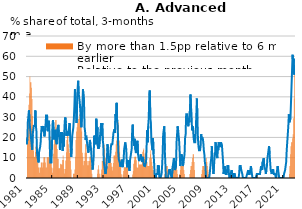
| Category | By more than 1.5pp relative to 6 months earlier |
|---|---|
| 1981-01-31 | 19.444 |
| 1981-02-28 | 22.222 |
| 1981-03-31 | 27.778 |
| 1981-04-30 | 36.111 |
| 1981-05-31 | 41.667 |
| 1981-06-30 | 50 |
| 1981-07-31 | 47.222 |
| 1981-08-31 | 47.222 |
| 1981-09-30 | 44.444 |
| 1981-10-31 | 38.889 |
| 1981-11-30 | 30.556 |
| 1981-12-31 | 16.667 |
| 1982-01-31 | 13.462 |
| 1982-02-28 | 10.47 |
| 1982-03-31 | 10.256 |
| 1982-04-30 | 12.821 |
| 1982-05-31 | 15.385 |
| 1982-06-30 | 23.077 |
| 1982-07-31 | 17.949 |
| 1982-08-31 | 15.385 |
| 1982-09-30 | 7.692 |
| 1982-10-31 | 5.128 |
| 1982-11-30 | 5.128 |
| 1982-12-31 | 2.564 |
| 1983-01-31 | 5.128 |
| 1983-02-28 | 5.128 |
| 1983-03-31 | 7.692 |
| 1983-04-30 | 7.692 |
| 1983-05-31 | 5.128 |
| 1983-06-30 | 7.692 |
| 1983-07-31 | 7.692 |
| 1983-08-31 | 10.256 |
| 1983-09-30 | 10.256 |
| 1983-10-31 | 10.256 |
| 1983-11-30 | 7.692 |
| 1983-12-31 | 5.128 |
| 1984-01-31 | 5.128 |
| 1984-02-29 | 10.256 |
| 1984-03-31 | 10.256 |
| 1984-04-30 | 10.256 |
| 1984-05-31 | 10.256 |
| 1984-06-30 | 12.821 |
| 1984-07-31 | 20.513 |
| 1984-08-31 | 20.513 |
| 1984-09-30 | 17.949 |
| 1984-10-31 | 10.256 |
| 1984-11-30 | 5.128 |
| 1984-12-31 | 2.564 |
| 1985-01-31 | 4.762 |
| 1985-02-28 | 11.905 |
| 1985-03-31 | 16.667 |
| 1985-04-30 | 19.048 |
| 1985-05-31 | 21.429 |
| 1985-06-30 | 28.571 |
| 1985-07-31 | 28.571 |
| 1985-08-31 | 21.429 |
| 1985-09-30 | 14.286 |
| 1985-10-31 | 9.524 |
| 1985-11-30 | 9.524 |
| 1985-12-31 | 4.762 |
| 1986-01-31 | 4.762 |
| 1986-02-28 | 4.762 |
| 1986-03-31 | 6.984 |
| 1986-04-30 | 6.825 |
| 1986-05-31 | 6.667 |
| 1986-06-30 | 6.667 |
| 1986-07-31 | 8.889 |
| 1986-08-31 | 11.111 |
| 1986-09-30 | 8.889 |
| 1986-10-31 | 4.444 |
| 1986-11-30 | 2.222 |
| 1986-12-31 | 4.444 |
| 1987-01-31 | 8.611 |
| 1987-02-28 | 12.639 |
| 1987-03-31 | 18.75 |
| 1987-04-30 | 20.833 |
| 1987-05-31 | 20.833 |
| 1987-06-30 | 16.667 |
| 1987-07-31 | 14.583 |
| 1987-08-31 | 12.5 |
| 1987-09-30 | 12.5 |
| 1987-10-31 | 8.333 |
| 1987-11-30 | 4.167 |
| 1987-12-31 | 0 |
| 1988-01-31 | 0 |
| 1988-02-29 | 0 |
| 1988-03-31 | 2.083 |
| 1988-04-30 | 2.083 |
| 1988-05-31 | 2.083 |
| 1988-06-30 | 4.167 |
| 1988-07-31 | 10.417 |
| 1988-08-31 | 18.75 |
| 1988-09-30 | 22.917 |
| 1988-10-31 | 25 |
| 1988-11-30 | 27.083 |
| 1988-12-31 | 27.083 |
| 1989-01-31 | 29.167 |
| 1989-02-28 | 29.167 |
| 1989-03-31 | 31.25 |
| 1989-04-30 | 29.167 |
| 1989-05-31 | 29.167 |
| 1989-06-30 | 25 |
| 1989-07-31 | 22.917 |
| 1989-08-31 | 12.5 |
| 1989-09-30 | 10.417 |
| 1989-10-31 | 6.25 |
| 1989-11-30 | 8.333 |
| 1989-12-31 | 8.333 |
| 1990-01-31 | 12.5 |
| 1990-02-28 | 16.667 |
| 1990-03-31 | 16.667 |
| 1990-04-30 | 12.5 |
| 1990-05-31 | 8.333 |
| 1990-06-30 | 6.25 |
| 1990-07-31 | 6.25 |
| 1990-08-31 | 8.333 |
| 1990-09-30 | 8.333 |
| 1990-10-31 | 10.417 |
| 1990-11-30 | 10.417 |
| 1990-12-31 | 10.417 |
| 1991-01-31 | 6.25 |
| 1991-02-28 | 2.083 |
| 1991-03-31 | 0 |
| 1991-04-30 | 0 |
| 1991-05-31 | 0 |
| 1991-06-30 | 0 |
| 1991-07-31 | 0 |
| 1991-08-31 | 0 |
| 1991-09-30 | 0 |
| 1991-10-31 | 0 |
| 1991-11-30 | 0 |
| 1991-12-31 | 2.083 |
| 1992-01-31 | 4.167 |
| 1992-02-29 | 6.25 |
| 1992-03-31 | 4.167 |
| 1992-04-30 | 2.083 |
| 1992-05-31 | 0 |
| 1992-06-30 | 0 |
| 1992-07-31 | 2.083 |
| 1992-08-31 | 4.167 |
| 1992-09-30 | 8.333 |
| 1992-10-31 | 8.333 |
| 1992-11-30 | 12.5 |
| 1992-12-31 | 14.583 |
| 1993-01-31 | 16.422 |
| 1993-02-28 | 14.093 |
| 1993-03-31 | 9.804 |
| 1993-04-30 | 7.843 |
| 1993-05-31 | 5.882 |
| 1993-06-30 | 5.882 |
| 1993-07-31 | 5.773 |
| 1993-08-31 | 5.664 |
| 1993-09-30 | 7.407 |
| 1993-10-31 | 9.259 |
| 1993-11-30 | 11.111 |
| 1993-12-31 | 11.111 |
| 1994-01-31 | 9.259 |
| 1994-02-28 | 7.407 |
| 1994-03-31 | 5.556 |
| 1994-04-30 | 3.704 |
| 1994-05-31 | 5.556 |
| 1994-06-30 | 7.407 |
| 1994-07-31 | 11.111 |
| 1994-08-31 | 11.111 |
| 1994-09-30 | 11.111 |
| 1994-10-31 | 12.963 |
| 1994-11-30 | 16.667 |
| 1994-12-31 | 18.519 |
| 1995-01-31 | 20.37 |
| 1995-02-28 | 24.074 |
| 1995-03-31 | 27.778 |
| 1995-04-30 | 25.926 |
| 1995-05-31 | 18.519 |
| 1995-06-30 | 12.963 |
| 1995-07-31 | 9.259 |
| 1995-08-31 | 5.556 |
| 1995-09-30 | 1.852 |
| 1995-10-31 | 0 |
| 1995-11-30 | 0 |
| 1995-12-31 | 1.754 |
| 1996-01-31 | 3.509 |
| 1996-02-29 | 5.263 |
| 1996-03-31 | 5.263 |
| 1996-04-30 | 5.263 |
| 1996-05-31 | 5.263 |
| 1996-06-30 | 5.263 |
| 1996-07-31 | 7.018 |
| 1996-08-31 | 7.018 |
| 1996-09-30 | 5.263 |
| 1996-10-31 | 1.754 |
| 1996-11-30 | 0 |
| 1996-12-31 | 0 |
| 1997-01-31 | 0 |
| 1997-02-28 | 0 |
| 1997-03-31 | 0 |
| 1997-04-30 | 0 |
| 1997-05-31 | 0 |
| 1997-06-30 | 1.754 |
| 1997-07-31 | 3.509 |
| 1997-08-31 | 7.018 |
| 1997-09-30 | 8.772 |
| 1997-10-31 | 10.526 |
| 1997-11-30 | 10.526 |
| 1997-12-31 | 10.526 |
| 1998-01-31 | 8.772 |
| 1998-02-28 | 5.263 |
| 1998-03-31 | 5.088 |
| 1998-04-30 | 5 |
| 1998-05-31 | 8.333 |
| 1998-06-30 | 6.667 |
| 1998-07-31 | 6.667 |
| 1998-08-31 | 6.667 |
| 1998-09-30 | 6.667 |
| 1998-10-31 | 6.667 |
| 1998-11-30 | 6.667 |
| 1998-12-31 | 8.333 |
| 1999-01-31 | 12.917 |
| 1999-02-28 | 13.75 |
| 1999-03-31 | 14.583 |
| 1999-04-30 | 10.417 |
| 1999-05-31 | 12.132 |
| 1999-06-30 | 11.887 |
| 1999-07-31 | 13.725 |
| 1999-08-31 | 9.804 |
| 1999-09-30 | 7.843 |
| 1999-10-31 | 5.882 |
| 1999-11-30 | 5.882 |
| 1999-12-31 | 5.882 |
| 2000-01-31 | 5.882 |
| 2000-02-29 | 9.804 |
| 2000-03-31 | 11.765 |
| 2000-04-30 | 13.725 |
| 2000-05-31 | 9.804 |
| 2000-06-30 | 7.843 |
| 2000-07-31 | 5.882 |
| 2000-08-31 | 3.922 |
| 2000-09-30 | 3.922 |
| 2000-10-31 | 1.961 |
| 2000-11-30 | 1.961 |
| 2000-12-31 | 0 |
| 2001-01-31 | 0 |
| 2001-02-28 | 0 |
| 2001-03-31 | 0 |
| 2001-04-30 | 0 |
| 2001-05-31 | 0 |
| 2001-06-30 | 0 |
| 2001-07-31 | 0 |
| 2001-08-31 | 0 |
| 2001-09-30 | 0 |
| 2001-10-31 | 0 |
| 2001-11-30 | 0 |
| 2001-12-31 | 0 |
| 2002-01-31 | 0 |
| 2002-02-28 | 0 |
| 2002-03-31 | 0 |
| 2002-04-30 | 0 |
| 2002-05-31 | 0 |
| 2002-06-30 | 1.961 |
| 2002-07-31 | 3.922 |
| 2002-08-31 | 5.882 |
| 2002-09-30 | 5.882 |
| 2002-10-31 | 5.882 |
| 2002-11-30 | 5.882 |
| 2002-12-31 | 3.922 |
| 2003-01-31 | 1.961 |
| 2003-02-28 | 0 |
| 2003-03-31 | 0 |
| 2003-04-30 | 0 |
| 2003-05-31 | 0 |
| 2003-06-30 | 0 |
| 2003-07-31 | 1.961 |
| 2003-08-31 | 3.922 |
| 2003-09-30 | 5.882 |
| 2003-10-31 | 5.882 |
| 2003-11-30 | 5.882 |
| 2003-12-31 | 5.882 |
| 2004-01-31 | 5.882 |
| 2004-02-29 | 5.882 |
| 2004-03-31 | 5.882 |
| 2004-04-30 | 5.882 |
| 2004-05-31 | 3.922 |
| 2004-06-30 | 1.961 |
| 2004-07-31 | 0 |
| 2004-08-31 | 0 |
| 2004-09-30 | 0 |
| 2004-10-31 | 1.961 |
| 2004-11-30 | 3.922 |
| 2004-12-31 | 5.882 |
| 2005-01-31 | 5.882 |
| 2005-02-28 | 5.882 |
| 2005-03-31 | 5.882 |
| 2005-04-30 | 5.882 |
| 2005-05-31 | 5.882 |
| 2005-06-30 | 3.922 |
| 2005-07-31 | 1.961 |
| 2005-08-31 | 0 |
| 2005-09-30 | 0 |
| 2005-10-31 | 0 |
| 2005-11-30 | 0 |
| 2005-12-31 | 0 |
| 2006-01-31 | 0 |
| 2006-02-28 | 0 |
| 2006-03-31 | 0 |
| 2006-04-30 | 0 |
| 2006-05-31 | 1.961 |
| 2006-06-30 | 3.922 |
| 2006-07-31 | 5.882 |
| 2006-08-31 | 5.882 |
| 2006-09-30 | 7.843 |
| 2006-10-31 | 9.804 |
| 2006-11-30 | 11.765 |
| 2006-12-31 | 11.765 |
| 2007-01-31 | 7.843 |
| 2007-02-28 | 3.922 |
| 2007-03-31 | 0 |
| 2007-04-30 | 0 |
| 2007-05-31 | 0 |
| 2007-06-30 | 0 |
| 2007-07-31 | 0 |
| 2007-08-31 | 0 |
| 2007-09-30 | 0 |
| 2007-10-31 | 0 |
| 2007-11-30 | 0 |
| 2007-12-31 | 0 |
| 2008-01-31 | 0 |
| 2008-02-29 | 0 |
| 2008-03-31 | 1.961 |
| 2008-04-30 | 3.922 |
| 2008-05-31 | 5.882 |
| 2008-06-30 | 5.882 |
| 2008-07-31 | 5.882 |
| 2008-08-31 | 5.882 |
| 2008-09-30 | 3.922 |
| 2008-10-31 | 5.882 |
| 2008-11-30 | 7.843 |
| 2008-12-31 | 9.804 |
| 2009-01-31 | 7.843 |
| 2009-02-28 | 5.882 |
| 2009-03-31 | 3.922 |
| 2009-04-30 | 1.961 |
| 2009-05-31 | 0 |
| 2009-06-30 | 0 |
| 2009-07-31 | 0 |
| 2009-08-31 | 0 |
| 2009-09-30 | 0 |
| 2009-10-31 | 0 |
| 2009-11-30 | 0 |
| 2009-12-31 | 0 |
| 2010-01-31 | 0 |
| 2010-02-28 | 0 |
| 2010-03-31 | 0 |
| 2010-04-30 | 0 |
| 2010-05-31 | 0 |
| 2010-06-30 | 0 |
| 2010-07-31 | 0 |
| 2010-08-31 | 0 |
| 2010-09-30 | 0 |
| 2010-10-31 | 0 |
| 2010-11-30 | 0 |
| 2010-12-31 | 0 |
| 2011-01-31 | 0 |
| 2011-02-28 | 0 |
| 2011-03-31 | 0 |
| 2011-04-30 | 0 |
| 2011-05-31 | 0 |
| 2011-06-30 | 0 |
| 2011-07-31 | 0 |
| 2011-08-31 | 0 |
| 2011-09-30 | 0 |
| 2011-10-31 | 0 |
| 2011-11-30 | 0 |
| 2011-12-31 | 0 |
| 2012-01-31 | 0 |
| 2012-02-29 | 0 |
| 2012-03-31 | 0 |
| 2012-04-30 | 0 |
| 2012-05-31 | 0 |
| 2012-06-30 | 0 |
| 2012-07-31 | 0 |
| 2012-08-31 | 0 |
| 2012-09-30 | 0 |
| 2012-10-31 | 0 |
| 2012-11-30 | 0 |
| 2012-12-31 | 0 |
| 2013-01-31 | 0 |
| 2013-02-28 | 0 |
| 2013-03-31 | 0 |
| 2013-04-30 | 0 |
| 2013-05-31 | 0 |
| 2013-06-30 | 0 |
| 2013-07-31 | 0 |
| 2013-08-31 | 0 |
| 2013-09-30 | 0 |
| 2013-10-31 | 0 |
| 2013-11-30 | 0 |
| 2013-12-31 | 0 |
| 2014-01-31 | 0 |
| 2014-02-28 | 0 |
| 2014-03-31 | 0 |
| 2014-04-30 | 0 |
| 2014-05-31 | 0 |
| 2014-06-30 | 0 |
| 2014-07-31 | 0 |
| 2014-08-31 | 0 |
| 2014-09-30 | 0 |
| 2014-10-31 | 0 |
| 2014-11-30 | 0 |
| 2014-12-31 | 0 |
| 2015-01-31 | 0 |
| 2015-02-28 | 0 |
| 2015-03-31 | 0 |
| 2015-04-30 | 0 |
| 2015-05-31 | 0 |
| 2015-06-30 | 0 |
| 2015-07-31 | 0 |
| 2015-08-31 | 0 |
| 2015-09-30 | 0 |
| 2015-10-31 | 0 |
| 2015-11-30 | 0 |
| 2015-12-31 | 0 |
| 2016-01-31 | 0 |
| 2016-02-29 | 0 |
| 2016-03-31 | 0 |
| 2016-04-30 | 0 |
| 2016-05-31 | 0 |
| 2016-06-30 | 0 |
| 2016-07-31 | 0 |
| 2016-08-31 | 0 |
| 2016-09-30 | 0 |
| 2016-10-31 | 0 |
| 2016-11-30 | 0 |
| 2016-12-31 | 0 |
| 2017-01-31 | 0 |
| 2017-02-28 | 0 |
| 2017-03-31 | 0 |
| 2017-04-30 | 0 |
| 2017-05-31 | 0 |
| 2017-06-30 | 0 |
| 2017-07-31 | 0 |
| 2017-08-31 | 0 |
| 2017-09-30 | 0 |
| 2017-10-31 | 0 |
| 2017-11-30 | 0 |
| 2017-12-31 | 0 |
| 2018-01-31 | 0 |
| 2018-02-28 | 0 |
| 2018-03-31 | 0 |
| 2018-04-30 | 0 |
| 2018-05-31 | 0 |
| 2018-06-30 | 0 |
| 2018-07-31 | 0 |
| 2018-08-31 | 0 |
| 2018-09-30 | 0 |
| 2018-10-31 | 0 |
| 2018-11-30 | 0 |
| 2018-12-31 | 0 |
| 2019-01-31 | 0 |
| 2019-02-28 | 0 |
| 2019-03-31 | 0 |
| 2019-04-30 | 0 |
| 2019-05-31 | 0 |
| 2019-06-30 | 0 |
| 2019-07-31 | 0 |
| 2019-08-31 | 0 |
| 2019-09-30 | 0 |
| 2019-10-31 | 0 |
| 2019-11-30 | 0 |
| 2019-12-31 | 0 |
| 2020-01-31 | 0 |
| 2020-02-29 | 0 |
| 2020-03-31 | 0 |
| 2020-04-30 | 0 |
| 2020-05-31 | 0 |
| 2020-06-30 | 0 |
| 2020-07-31 | 0 |
| 2020-08-31 | 0 |
| 2020-09-30 | 0 |
| 2020-10-31 | 0 |
| 2020-11-30 | 0 |
| 2020-12-31 | 0 |
| 2021-01-31 | 0 |
| 2021-02-28 | 0 |
| 2021-03-31 | 0 |
| 2021-04-30 | 0 |
| 2021-05-31 | 0 |
| 2021-06-30 | 0 |
| 2021-07-31 | 0 |
| 2021-08-31 | 0 |
| 2021-09-30 | 0 |
| 2021-10-31 | 0 |
| 2021-11-30 | 1.961 |
| 2021-12-31 | 5.882 |
| 2022-01-31 | 11.765 |
| 2022-02-28 | 15.686 |
| 2022-03-31 | 17.647 |
| 2022-04-30 | 17.647 |
| 2022-05-31 | 19.608 |
| 2022-06-30 | 21.569 |
| 2022-07-31 | 29.412 |
| 2022-08-31 | 39.216 |
| 2022-09-30 | 50.98 |
| 2022-10-31 | 58.824 |
| 2022-11-30 | 64.706 |